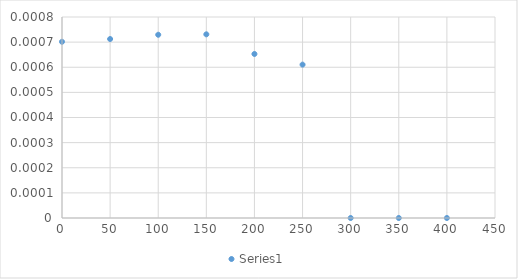
| Category | Series 0 |
|---|---|
| 0.0 | 0.001 |
| 50.0 | 0.001 |
| 100.0 | 0.001 |
| 150.0 | 0.001 |
| 200.0 | 0.001 |
| 250.0 | 0.001 |
| 300.0 | 0 |
| 350.0 | 0 |
| 400.0 | 0 |